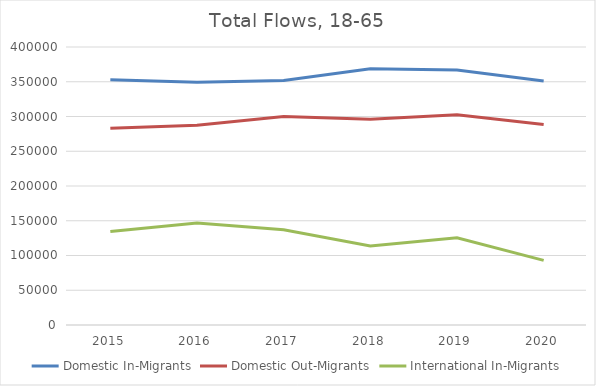
| Category | Domestic In-Migrants | Domestic Out-Migrants | International In-Migrants |
|---|---|---|---|
| 2015 | 352803 | 282945 | 134568 |
| 2016 | 349161 | 287338 | 146896 |
| 2017 | 351924 | 300086 | 137166 |
| 2018 | 368526 | 295975 | 113635 |
| 2019 | 366856 | 302525 | 125365 |
| 2020 | 350968 | 288586 | 92986 |